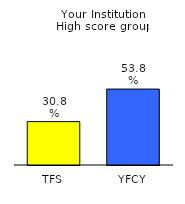
| Category | Series 0 |
|---|---|
| TFS | 0.308 |
| YFCY | 0.538 |